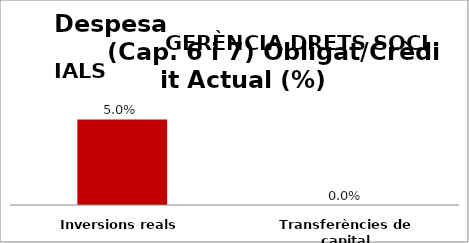
| Category | Series 0 |
|---|---|
| Inversions reals | 0.05 |
| Transferències de capital | 0 |